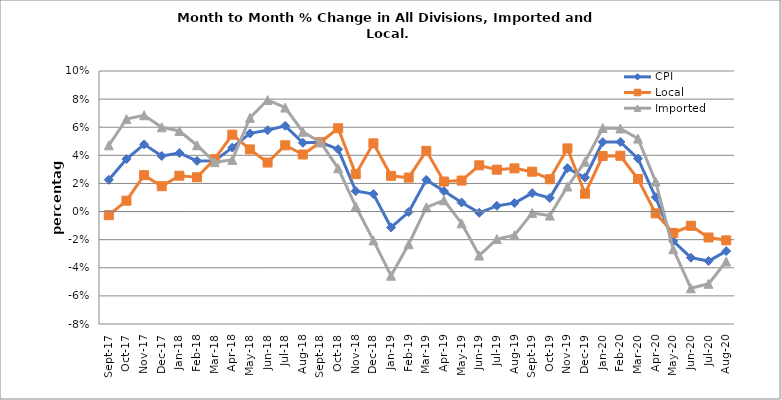
| Category | CPI | Local | Imported |
|---|---|---|---|
| 2017-09-01 | 0.023 | -0.003 | 0.047 |
| 2017-10-01 | 0.037 | 0.008 | 0.066 |
| 2017-11-01 | 0.048 | 0.026 | 0.069 |
| 2017-12-01 | 0.04 | 0.018 | 0.06 |
| 2018-01-01 | 0.042 | 0.025 | 0.057 |
| 2018-02-01 | 0.036 | 0.024 | 0.047 |
| 2018-03-01 | 0.036 | 0.037 | 0.035 |
| 2018-04-01 | 0.045 | 0.055 | 0.037 |
| 2018-05-01 | 0.056 | 0.044 | 0.067 |
| 2018-06-01 | 0.058 | 0.035 | 0.079 |
| 2018-07-01 | 0.061 | 0.047 | 0.074 |
| 2018-08-01 | 0.049 | 0.041 | 0.057 |
| 2018-09-01 | 0.049 | 0.049 | 0.049 |
| 2018-10-01 | 0.044 | 0.059 | 0.031 |
| 2018-11-01 | 0.015 | 0.027 | 0.004 |
| 2018-12-01 | 0.012 | 0.049 | -0.021 |
| 2019-01-01 | -0.011 | 0.025 | -0.046 |
| 2019-02-01 | 0 | 0.024 | -0.023 |
| 2019-03-01 | 0.023 | 0.043 | 0.003 |
| 2019-04-01 | 0.015 | 0.021 | 0.008 |
| 2019-05-01 | 0.006 | 0.022 | -0.008 |
| 2019-06-01 | -0.001 | 0.033 | -0.031 |
| 2019-07-01 | 0.004 | 0.03 | -0.02 |
| 2019-08-01 | 0.006 | 0.031 | -0.017 |
| 2019-09-01 | 0.013 | 0.028 | -0.001 |
| 2019-10-01 | 0.01 | 0.023 | -0.003 |
| 2019-11-01 | 0.031 | 0.045 | 0.018 |
| 2019-12-01 | 0.024 | 0.013 | 0.035 |
| 2020-01-01 | 0.049 | 0.039 | 0.059 |
| 2020-02-01 | 0.05 | 0.04 | 0.059 |
| 2020-03-01 | 0.038 | 0.023 | 0.052 |
| 2020-04-01 | 0.01 | -0.001 | 0.021 |
| 2020-05-01 | -0.021 | -0.015 | -0.027 |
| 2020-06-01 | -0.033 | -0.01 | -0.055 |
| 2020-07-01 | -0.035 | -0.018 | -0.051 |
| 2020-08-01 | -0.028 | -0.02 | -0.036 |